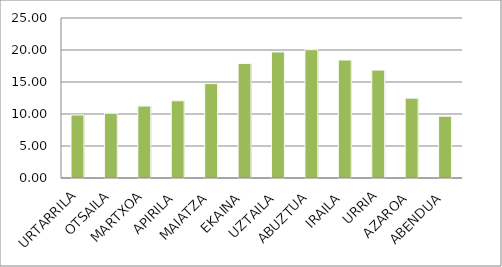
| Category | Series 0 |
|---|---|
| URTARRILA | 9.84 |
| OTSAILA | 10.11 |
| MARTXOA | 11.24 |
| APIRILA | 12.06 |
| MAIATZA | 14.75 |
| EKAINA | 17.89 |
| UZTAILA | 19.69 |
| ABUZTUA | 20.05 |
| IRAILA | 18.43 |
| URRIA | 16.86 |
| AZAROA | 12.48 |
| ABENDUA | 9.65 |